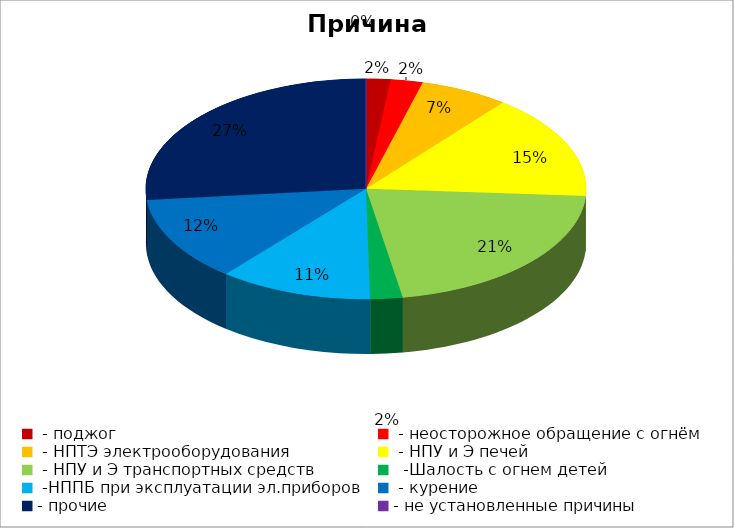
| Category | Причина пожара |
|---|---|
|  - поджог | 3 |
|  - неосторожное обращение с огнём | 4 |
|  - НПТЭ электрооборудования | 11 |
|  - НПУ и Э печей | 26 |
|  - НПУ и Э транспортных средств | 36 |
|   -Шалость с огнем детей | 4 |
|  -НППБ при эксплуатации эл.приборов | 19 |
|  - курение | 21 |
| - прочие | 45 |
| - не установленные причины | 0 |